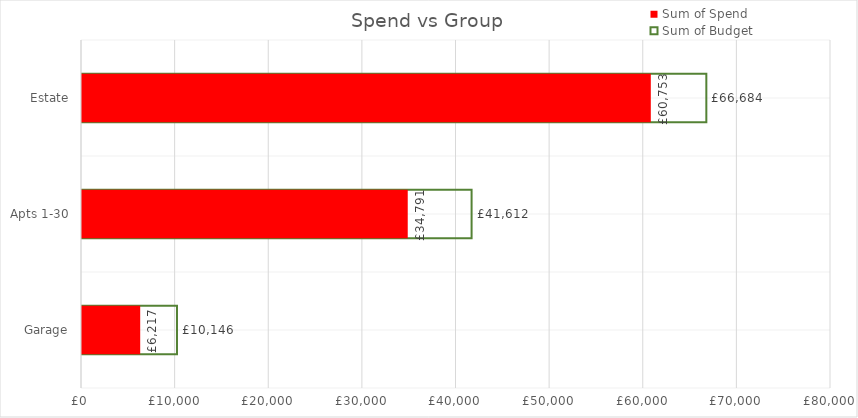
| Category | Sum of Budget | Sum of Spend |
|---|---|---|
| Garage | 10146 | 6216.68 |
| Apts 1-30 | 41612 | 34791.46 |
| Estate | 66684 | 60753.06 |